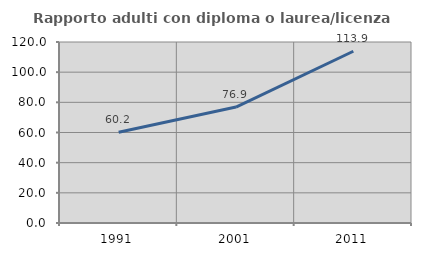
| Category | Rapporto adulti con diploma o laurea/licenza media  |
|---|---|
| 1991.0 | 60.219 |
| 2001.0 | 76.86 |
| 2011.0 | 113.854 |